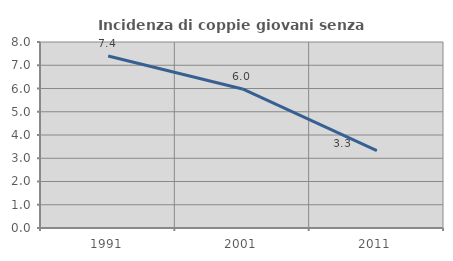
| Category | Incidenza di coppie giovani senza figli |
|---|---|
| 1991.0 | 7.4 |
| 2001.0 | 5.98 |
| 2011.0 | 3.332 |